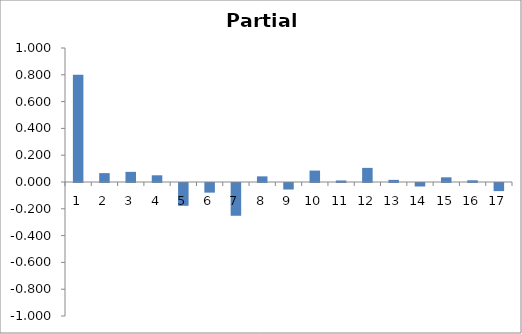
| Category | rk,j |
|---|---|
| 0 | 0.8 |
| 1 | 0.066 |
| 2 | 0.076 |
| 3 | 0.05 |
| 4 | -0.17 |
| 5 | -0.072 |
| 6 | -0.245 |
| 7 | 0.042 |
| 8 | -0.049 |
| 9 | 0.085 |
| 10 | 0.012 |
| 11 | 0.105 |
| 12 | 0.016 |
| 13 | -0.026 |
| 14 | 0.035 |
| 15 | 0.013 |
| 16 | -0.061 |